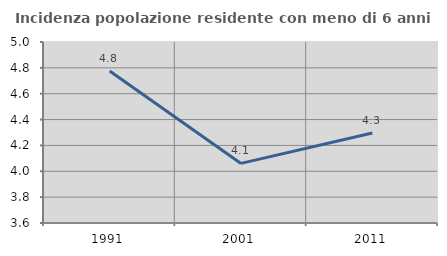
| Category | Incidenza popolazione residente con meno di 6 anni |
|---|---|
| 1991.0 | 4.776 |
| 2001.0 | 4.061 |
| 2011.0 | 4.296 |